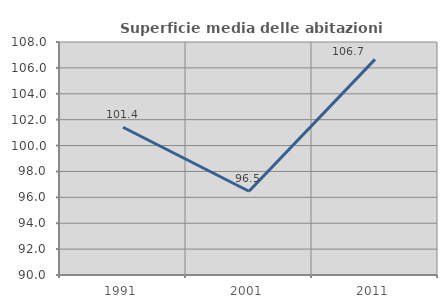
| Category | Superficie media delle abitazioni occupate |
|---|---|
| 1991.0 | 101.416 |
| 2001.0 | 96.472 |
| 2011.0 | 106.656 |